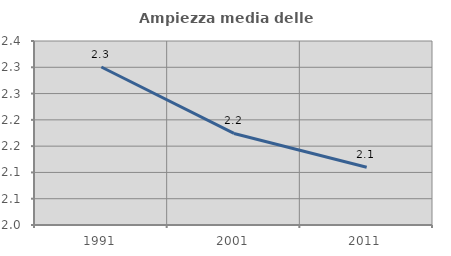
| Category | Ampiezza media delle famiglie |
|---|---|
| 1991.0 | 2.301 |
| 2001.0 | 2.174 |
| 2011.0 | 2.11 |